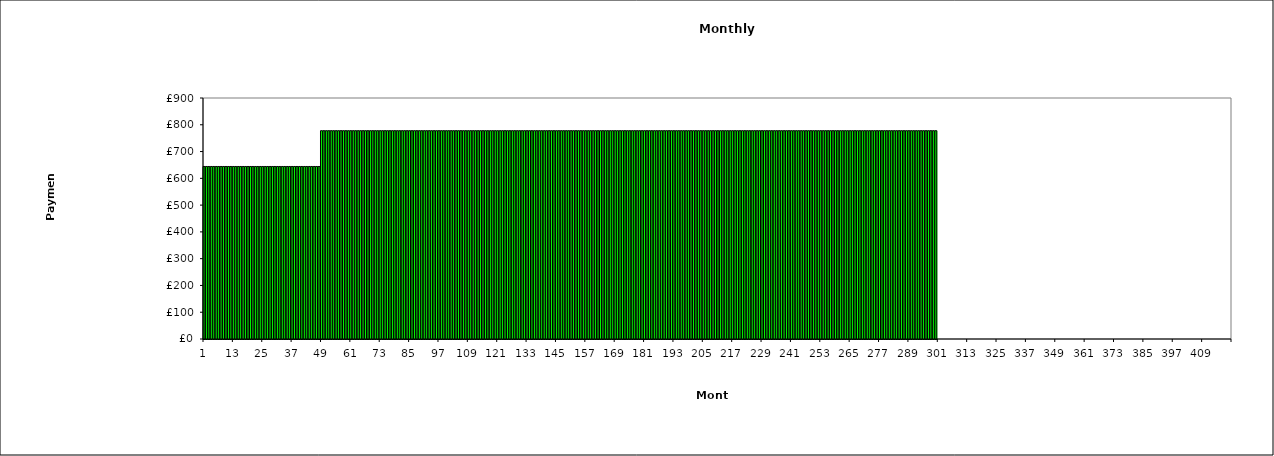
| Category | Payments |
|---|---|
| 1.0 | 644.259 |
| 2.0 | 644.259 |
| 3.0 | 644.259 |
| 4.0 | 644.259 |
| 5.0 | 644.259 |
| 6.0 | 644.259 |
| 7.0 | 644.259 |
| 8.0 | 644.259 |
| 9.0 | 644.259 |
| 10.0 | 644.259 |
| 11.0 | 644.259 |
| 12.0 | 644.259 |
| 13.0 | 644.259 |
| 14.0 | 644.259 |
| 15.0 | 644.259 |
| 16.0 | 644.259 |
| 17.0 | 644.259 |
| 18.0 | 644.259 |
| 19.0 | 644.259 |
| 20.0 | 644.259 |
| 21.0 | 644.259 |
| 22.0 | 644.259 |
| 23.0 | 644.259 |
| 24.0 | 644.259 |
| 25.0 | 644.259 |
| 26.0 | 644.259 |
| 27.0 | 644.259 |
| 28.0 | 644.259 |
| 29.0 | 644.259 |
| 30.0 | 644.259 |
| 31.0 | 644.259 |
| 32.0 | 644.259 |
| 33.0 | 644.259 |
| 34.0 | 644.259 |
| 35.0 | 644.259 |
| 36.0 | 644.259 |
| 37.0 | 644.259 |
| 38.0 | 644.259 |
| 39.0 | 644.259 |
| 40.0 | 644.259 |
| 41.0 | 644.259 |
| 42.0 | 644.259 |
| 43.0 | 644.259 |
| 44.0 | 644.259 |
| 45.0 | 644.259 |
| 46.0 | 644.259 |
| 47.0 | 644.259 |
| 48.0 | 644.259 |
| 49.0 | 777.904 |
| 50.0 | 777.904 |
| 51.0 | 777.904 |
| 52.0 | 777.904 |
| 53.0 | 777.904 |
| 54.0 | 777.904 |
| 55.0 | 777.904 |
| 56.0 | 777.904 |
| 57.0 | 777.904 |
| 58.0 | 777.904 |
| 59.0 | 777.904 |
| 60.0 | 777.904 |
| 61.0 | 777.904 |
| 62.0 | 777.904 |
| 63.0 | 777.904 |
| 64.0 | 777.904 |
| 65.0 | 777.904 |
| 66.0 | 777.904 |
| 67.0 | 777.904 |
| 68.0 | 777.904 |
| 69.0 | 777.904 |
| 70.0 | 777.904 |
| 71.0 | 777.904 |
| 72.0 | 777.904 |
| 73.0 | 777.904 |
| 74.0 | 777.904 |
| 75.0 | 777.904 |
| 76.0 | 777.904 |
| 77.0 | 777.904 |
| 78.0 | 777.904 |
| 79.0 | 777.904 |
| 80.0 | 777.904 |
| 81.0 | 777.904 |
| 82.0 | 777.904 |
| 83.0 | 777.904 |
| 84.0 | 777.904 |
| 85.0 | 777.904 |
| 86.0 | 777.904 |
| 87.0 | 777.904 |
| 88.0 | 777.904 |
| 89.0 | 777.904 |
| 90.0 | 777.904 |
| 91.0 | 777.904 |
| 92.0 | 777.904 |
| 93.0 | 777.904 |
| 94.0 | 777.904 |
| 95.0 | 777.904 |
| 96.0 | 777.904 |
| 97.0 | 777.904 |
| 98.0 | 777.904 |
| 99.0 | 777.904 |
| 100.0 | 777.904 |
| 101.0 | 777.904 |
| 102.0 | 777.904 |
| 103.0 | 777.904 |
| 104.0 | 777.904 |
| 105.0 | 777.904 |
| 106.0 | 777.904 |
| 107.0 | 777.904 |
| 108.0 | 777.904 |
| 109.0 | 777.904 |
| 110.0 | 777.904 |
| 111.0 | 777.904 |
| 112.0 | 777.904 |
| 113.0 | 777.904 |
| 114.0 | 777.904 |
| 115.0 | 777.904 |
| 116.0 | 777.904 |
| 117.0 | 777.904 |
| 118.0 | 777.904 |
| 119.0 | 777.904 |
| 120.0 | 777.904 |
| 121.0 | 777.904 |
| 122.0 | 777.904 |
| 123.0 | 777.904 |
| 124.0 | 777.904 |
| 125.0 | 777.904 |
| 126.0 | 777.904 |
| 127.0 | 777.904 |
| 128.0 | 777.904 |
| 129.0 | 777.904 |
| 130.0 | 777.904 |
| 131.0 | 777.904 |
| 132.0 | 777.904 |
| 133.0 | 777.904 |
| 134.0 | 777.904 |
| 135.0 | 777.904 |
| 136.0 | 777.904 |
| 137.0 | 777.904 |
| 138.0 | 777.904 |
| 139.0 | 777.904 |
| 140.0 | 777.904 |
| 141.0 | 777.904 |
| 142.0 | 777.904 |
| 143.0 | 777.904 |
| 144.0 | 777.904 |
| 145.0 | 777.904 |
| 146.0 | 777.904 |
| 147.0 | 777.904 |
| 148.0 | 777.904 |
| 149.0 | 777.904 |
| 150.0 | 777.904 |
| 151.0 | 777.904 |
| 152.0 | 777.904 |
| 153.0 | 777.904 |
| 154.0 | 777.904 |
| 155.0 | 777.904 |
| 156.0 | 777.904 |
| 157.0 | 777.904 |
| 158.0 | 777.904 |
| 159.0 | 777.904 |
| 160.0 | 777.904 |
| 161.0 | 777.904 |
| 162.0 | 777.904 |
| 163.0 | 777.904 |
| 164.0 | 777.904 |
| 165.0 | 777.904 |
| 166.0 | 777.904 |
| 167.0 | 777.904 |
| 168.0 | 777.904 |
| 169.0 | 777.904 |
| 170.0 | 777.904 |
| 171.0 | 777.904 |
| 172.0 | 777.904 |
| 173.0 | 777.904 |
| 174.0 | 777.904 |
| 175.0 | 777.904 |
| 176.0 | 777.904 |
| 177.0 | 777.904 |
| 178.0 | 777.904 |
| 179.0 | 777.904 |
| 180.0 | 777.904 |
| 181.0 | 777.904 |
| 182.0 | 777.904 |
| 183.0 | 777.904 |
| 184.0 | 777.904 |
| 185.0 | 777.904 |
| 186.0 | 777.904 |
| 187.0 | 777.904 |
| 188.0 | 777.904 |
| 189.0 | 777.904 |
| 190.0 | 777.904 |
| 191.0 | 777.904 |
| 192.0 | 777.904 |
| 193.0 | 777.904 |
| 194.0 | 777.904 |
| 195.0 | 777.904 |
| 196.0 | 777.904 |
| 197.0 | 777.904 |
| 198.0 | 777.904 |
| 199.0 | 777.904 |
| 200.0 | 777.904 |
| 201.0 | 777.904 |
| 202.0 | 777.904 |
| 203.0 | 777.904 |
| 204.0 | 777.904 |
| 205.0 | 777.904 |
| 206.0 | 777.904 |
| 207.0 | 777.904 |
| 208.0 | 777.904 |
| 209.0 | 777.904 |
| 210.0 | 777.904 |
| 211.0 | 777.904 |
| 212.0 | 777.904 |
| 213.0 | 777.904 |
| 214.0 | 777.904 |
| 215.0 | 777.904 |
| 216.0 | 777.904 |
| 217.0 | 777.904 |
| 218.0 | 777.904 |
| 219.0 | 777.904 |
| 220.0 | 777.904 |
| 221.0 | 777.904 |
| 222.0 | 777.904 |
| 223.0 | 777.904 |
| 224.0 | 777.904 |
| 225.0 | 777.904 |
| 226.0 | 777.904 |
| 227.0 | 777.904 |
| 228.0 | 777.904 |
| 229.0 | 777.904 |
| 230.0 | 777.904 |
| 231.0 | 777.904 |
| 232.0 | 777.904 |
| 233.0 | 777.904 |
| 234.0 | 777.904 |
| 235.0 | 777.904 |
| 236.0 | 777.904 |
| 237.0 | 777.904 |
| 238.0 | 777.904 |
| 239.0 | 777.904 |
| 240.0 | 777.904 |
| 241.0 | 777.904 |
| 242.0 | 777.904 |
| 243.0 | 777.904 |
| 244.0 | 777.904 |
| 245.0 | 777.904 |
| 246.0 | 777.904 |
| 247.0 | 777.904 |
| 248.0 | 777.904 |
| 249.0 | 777.904 |
| 250.0 | 777.904 |
| 251.0 | 777.904 |
| 252.0 | 777.904 |
| 253.0 | 777.904 |
| 254.0 | 777.904 |
| 255.0 | 777.904 |
| 256.0 | 777.904 |
| 257.0 | 777.904 |
| 258.0 | 777.904 |
| 259.0 | 777.904 |
| 260.0 | 777.904 |
| 261.0 | 777.904 |
| 262.0 | 777.904 |
| 263.0 | 777.904 |
| 264.0 | 777.904 |
| 265.0 | 777.904 |
| 266.0 | 777.904 |
| 267.0 | 777.904 |
| 268.0 | 777.904 |
| 269.0 | 777.904 |
| 270.0 | 777.904 |
| 271.0 | 777.904 |
| 272.0 | 777.904 |
| 273.0 | 777.904 |
| 274.0 | 777.904 |
| 275.0 | 777.904 |
| 276.0 | 777.904 |
| 277.0 | 777.904 |
| 278.0 | 777.904 |
| 279.0 | 777.904 |
| 280.0 | 777.904 |
| 281.0 | 777.904 |
| 282.0 | 777.904 |
| 283.0 | 777.904 |
| 284.0 | 777.904 |
| 285.0 | 777.904 |
| 286.0 | 777.904 |
| 287.0 | 777.904 |
| 288.0 | 777.904 |
| 289.0 | 777.904 |
| 290.0 | 777.904 |
| 291.0 | 777.904 |
| 292.0 | 777.904 |
| 293.0 | 777.904 |
| 294.0 | 777.904 |
| 295.0 | 777.904 |
| 296.0 | 777.904 |
| 297.0 | 777.904 |
| 298.0 | 777.904 |
| 299.0 | 777.904 |
| 300.0 | 777.904 |
| 301.0 | 0 |
| 302.0 | 0 |
| 303.0 | 0 |
| 304.0 | 0 |
| 305.0 | 0 |
| 306.0 | 0 |
| 307.0 | 0 |
| 308.0 | 0 |
| 309.0 | 0 |
| 310.0 | 0 |
| 311.0 | 0 |
| 312.0 | 0 |
| 313.0 | 0 |
| 314.0 | 0 |
| 315.0 | 0 |
| 316.0 | 0 |
| 317.0 | 0 |
| 318.0 | 0 |
| 319.0 | 0 |
| 320.0 | 0 |
| 321.0 | 0 |
| 322.0 | 0 |
| 323.0 | 0 |
| 324.0 | 0 |
| 325.0 | 0 |
| 326.0 | 0 |
| 327.0 | 0 |
| 328.0 | 0 |
| 329.0 | 0 |
| 330.0 | 0 |
| 331.0 | 0 |
| 332.0 | 0 |
| 333.0 | 0 |
| 334.0 | 0 |
| 335.0 | 0 |
| 336.0 | 0 |
| 337.0 | 0 |
| 338.0 | 0 |
| 339.0 | 0 |
| 340.0 | 0 |
| 341.0 | 0 |
| 342.0 | 0 |
| 343.0 | 0 |
| 344.0 | 0 |
| 345.0 | 0 |
| 346.0 | 0 |
| 347.0 | 0 |
| 348.0 | 0 |
| 349.0 | 0 |
| 350.0 | 0 |
| 351.0 | 0 |
| 352.0 | 0 |
| 353.0 | 0 |
| 354.0 | 0 |
| 355.0 | 0 |
| 356.0 | 0 |
| 357.0 | 0 |
| 358.0 | 0 |
| 359.0 | 0 |
| 360.0 | 0 |
| 361.0 | 0 |
| 362.0 | 0 |
| 363.0 | 0 |
| 364.0 | 0 |
| 365.0 | 0 |
| 366.0 | 0 |
| 367.0 | 0 |
| 368.0 | 0 |
| 369.0 | 0 |
| 370.0 | 0 |
| 371.0 | 0 |
| 372.0 | 0 |
| 373.0 | 0 |
| 374.0 | 0 |
| 375.0 | 0 |
| 376.0 | 0 |
| 377.0 | 0 |
| 378.0 | 0 |
| 379.0 | 0 |
| 380.0 | 0 |
| 381.0 | 0 |
| 382.0 | 0 |
| 383.0 | 0 |
| 384.0 | 0 |
| 385.0 | 0 |
| 386.0 | 0 |
| 387.0 | 0 |
| 388.0 | 0 |
| 389.0 | 0 |
| 390.0 | 0 |
| 391.0 | 0 |
| 392.0 | 0 |
| 393.0 | 0 |
| 394.0 | 0 |
| 395.0 | 0 |
| 396.0 | 0 |
| 397.0 | 0 |
| 398.0 | 0 |
| 399.0 | 0 |
| 400.0 | 0 |
| 401.0 | 0 |
| 402.0 | 0 |
| 403.0 | 0 |
| 404.0 | 0 |
| 405.0 | 0 |
| 406.0 | 0 |
| 407.0 | 0 |
| 408.0 | 0 |
| 409.0 | 0 |
| 410.0 | 0 |
| 411.0 | 0 |
| 412.0 | 0 |
| 413.0 | 0 |
| 414.0 | 0 |
| 415.0 | 0 |
| 416.0 | 0 |
| 417.0 | 0 |
| 418.0 | 0 |
| 419.0 | 0 |
| 420.0 | 0 |